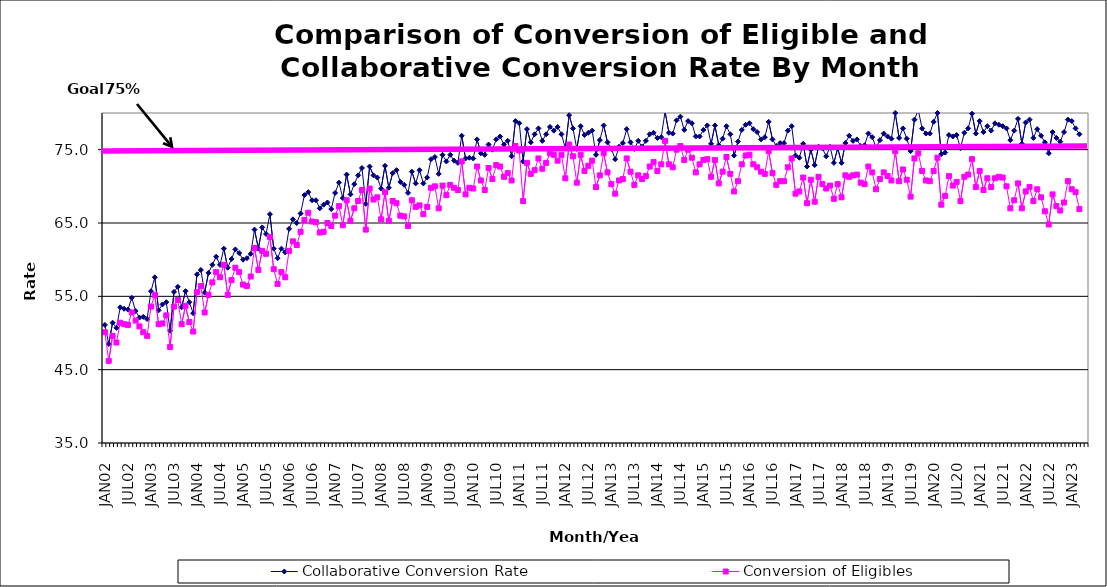
| Category | Collaborative Conversion Rate | Conversion of Eligibles |
|---|---|---|
| JAN02 | 51.1 | 50.1 |
| FEB02 | 48.5 | 46.2 |
| MAR02 | 51.4 | 49.6 |
| APR02 | 50.7 | 48.7 |
| MAY02 | 53.5 | 51.4 |
| JUN02 | 53.3 | 51.2 |
| JUL02 | 53.2 | 51.1 |
| AUG02 | 54.8 | 52.8 |
| SEP02 | 53 | 51.7 |
| OCT02 | 52.1 | 50.9 |
| NOV02 | 52.2 | 50.1 |
| DEC02 | 51.9 | 49.6 |
| JAN03 | 55.7 | 53.6 |
| FEB03 | 57.6 | 55.2 |
| MAR03 | 53.1 | 51.2 |
| APR03 | 53.9 | 51.3 |
| MAY03 | 54.2 | 52.4 |
| JUN03 | 50.3 | 48.1 |
| JUL03 | 55.6 | 53.6 |
| AUG03 | 56.3 | 54.5 |
| SEP03 | 53.5 | 51.2 |
| OCT03 | 55.7 | 53.7 |
| NOV03 | 54.2 | 51.5 |
| DEC03 | 52.7 | 50.2 |
| JAN04 | 58 | 55.6 |
| FEB04 | 58.6 | 56.4 |
| MAR04 | 55.5 | 52.8 |
| APR04 | 58.2 | 55.2 |
| MAY04 | 59.3 | 56.9 |
| JUN04 | 60.4 | 58.3 |
| JUL04 | 59.3 | 57.6 |
| AUG04 | 61.5 | 59.3 |
| SEP04 | 58.9 | 55.2 |
| OCT04 | 60.1 | 57.2 |
| NOV04 | 61.4 | 58.9 |
| DEC04 | 60.9 | 58.3 |
| JAN05 | 60 | 56.6 |
| FEB05 | 60.2 | 56.4 |
| MAR05 | 60.8 | 57.7 |
| APR05 | 64.1 | 61.6 |
| MAY05 | 61.5 | 58.6 |
| JUN05 | 64.4 | 61.2 |
| JUL05 | 63.5 | 60.8 |
| AUG05 | 66.2 | 63.1 |
| SEP05 | 61.5 | 58.7 |
| OCT05 | 60.2 | 56.7 |
| NOV05 | 61.5 | 58.3 |
| DEC05 | 61 | 57.6 |
| JAN06 | 64.2 | 61.2 |
| FEB06 | 65.5 | 62.5 |
| MAR06 | 65 | 62 |
| APR06 | 66.3 | 63.8 |
| MAY06 | 68.8 | 65.4 |
| JUN06 | 69.2 | 66.4 |
| JUL06 | 68.1 | 65.2 |
| AUG06 | 68.1 | 65.1 |
| SEP06 | 67 | 63.7 |
| OCT06 | 67.5 | 63.8 |
| NOV06 | 67.8 | 65 |
| DEC06 | 66.9 | 64.6 |
| JAN07 | 69.1 | 66 |
| FEB07 | 70.5 | 67.3 |
| MAR07 | 68.4 | 64.7 |
| APR07 | 71.6 | 68.1 |
| MAY07 | 68.9 | 65.3 |
| JUN07 | 70.3 | 67 |
| JUL07 | 71.5 | 68 |
| AUG07 | 72.5 | 69.5 |
| SEP07 | 67.6 | 64.1 |
| OCT07 | 72.7 | 69.7 |
| NOV07 | 71.5 | 68.2 |
| DEC07 | 71.2 | 68.5 |
| JAN08 | 69.7 | 65.5 |
| FEB08 | 72.8 | 69.2 |
| MAR08 | 69.8 | 65.3 |
| APR08 | 71.8 | 68 |
| MAY08 | 72.2 | 67.7 |
| JUN08 | 70.6 | 66 |
| JUL08 | 70.2 | 65.9 |
| AUG08 | 69.1 | 64.6 |
| SEP08 | 72 | 68.1 |
| OCT08 | 70.4 | 67.2 |
| NOV08 | 72.2 | 67.4 |
| DEC08 | 70.4 | 66.2 |
| JAN09 | 71.2 | 67.2 |
| FEB09 | 73.7 | 69.8 |
| MAR09 | 74 | 70 |
| APR09 | 71.7 | 67 |
| MAY09 | 74.3 | 70.1 |
| JUN09 | 73.4 | 68.8 |
| JUL09 | 74.3 | 70.2 |
| AUG09 | 73.5 | 69.8 |
| SEP09 | 73.2 | 69.5 |
| OCT09 | 76.9 | 73.4 |
| NOV09 | 73.8 | 68.9 |
| DEC09 | 73.9 | 69.8 |
| JAN10 | 73.8 | 69.7 |
| FEB10 | 76.4 | 72.7 |
| MAR10 | 74.5 | 70.8 |
| APR10 | 74.3 | 69.5 |
| MAY10 | 75.7 | 72.5 |
| JUN10 | 75 | 71 |
| JUL10 | 76.4 | 72.9 |
| AUG10 | 76.8 | 72.7 |
| SEP10 | 75.7 | 71.3 |
| OCT10 | 76.2 | 71.8 |
| NOV10 | 74.1 | 70.8 |
| DEC10 | 78.9 | 75.5 |
| JAN11 | 78.6 | 74.9 |
| FEB11 | 73.4 | 68 |
| MAR11 | 77.8 | 73.2 |
| APR11 | 76 | 71.7 |
| MAY11 | 77.1 | 72.2 |
| JUN11 | 77.9 | 73.8 |
| JUL11 | 76.2 | 72.4 |
| AUG11 | 77.1 | 73.2 |
| SEP11 | 78.1 | 74.5 |
| OCT11 | 77.6 | 74.3 |
| NOV11 | 78.1 | 73.5 |
| DEC11 | 77.1 | 74.3 |
| JAN12 | 75.2 | 71.1 |
| FEB12 | 79.7 | 75.7 |
| MAR12 | 77.9 | 74.1 |
| APR12 | 75.1 | 70.5 |
| MAY12 | 78.2 | 74.3 |
| JUN12 | 77 | 72.1 |
| JUL12 | 77.3 | 72.8 |
| AUG12 | 77.6 | 73.5 |
| SEP12 | 74.3 | 69.9 |
| OCT12 | 76.3 | 71.5 |
| NOV12 | 78.3 | 74.5 |
| DEC12 | 76 | 71.9 |
| JAN13 | 75.1 | 70.3 |
| FEB13 | 73.7 | 69 |
| MAR13 | 75.4 | 70.8 |
| APR13 | 75.9 | 71 |
| MAY13 | 77.8 | 73.8 |
| JUN13 | 76 | 72 |
| JUL13 | 75.1 | 70.2 |
| AUG13 | 76.2 | 71.5 |
| SEP13 | 75.4 | 71 |
| OCT13 | 76.2 | 71.4 |
| NOV13 | 77.1 | 72.7 |
| DEC13 | 77.3 | 73.3 |
| JAN14 | 76.6 | 72.1 |
| FEB14 | 76.7 | 73 |
| MAR14 | 80.2 | 76.2 |
| APR14 | 77.3 | 73 |
| MAY14 | 77.2 | 72.6 |
| JUN14 | 79 | 75 |
| JUL14 | 79.5 | 75.5 |
| AUG14 | 77.7 | 73.6 |
| SEP14 | 78.9 | 75 |
| OCT14 | 78.6 | 73.9 |
| NOV14 | 76.8 | 71.9 |
| DEC14 | 76.8 | 73 |
| JAN15 | 77.7 | 73.6 |
| FEB15 | 78.3 | 73.7 |
| MAR15 | 75.8 | 71.3 |
| APR15 | 78.3 | 73.6 |
| MAY15 | 75.6 | 70.4 |
| JUN15 | 76.5 | 72 |
| JUL15 | 78.2 | 74 |
| AUG15 | 77.1 | 71.7 |
| SEP15 | 74.2 | 69.3 |
| OCT15 | 76.1 | 70.7 |
| NOV15 | 77.7 | 73 |
| DEC15 | 78.4 | 74.2 |
| JAN16 | 78.6 | 74.3 |
| FEB16 | 77.8 | 73 |
| MAR16 | 77.4 | 72.6 |
| APR16 | 76.4 | 72 |
| MAY16 | 76.7 | 71.7 |
| JUN16 | 78.8 | 74.8 |
| JUL16 | 76.4 | 71.8 |
| AUG16 | 75.5 | 70.2 |
| SEP16 | 75.9 | 70.7 |
| OCT16 | 75.9 | 70.7 |
| NOV16 | 77.6 | 72.6 |
| DEC16 | 78.2 | 73.8 |
| JAN17 | 74.2 | 69 |
| FEB17 | 73.9 | 69.3 |
| MAR17 | 75.8 | 71.2 |
| APR17 | 72.7 | 67.7 |
| MAY17 | 75 | 70.9 |
| JUN17 | 72.9 | 67.9 |
| JUL17 | 75.4 | 71.3 |
| AUG17 | 75.2 | 70.3 |
| SEP17 | 74.1 | 69.7 |
| OCT17 | 75.4 | 70.1 |
| NOV17 | 73.2 | 68.3 |
| DEC17 | 75.2 | 70.3 |
| JAN18 | 73.2 | 68.5 |
| FEB18 | 75.9 | 71.5 |
| MAR18 | 76.9 | 71.3 |
| APR18 | 76.2 | 71.5 |
| MAY18 | 76.4 | 71.6 |
| JUN18 | 75.5 | 70.5 |
| JUL18 | 75.6 | 70.3 |
| AUG18 | 77.2 | 72.7 |
| SEP18 | 76.7 | 71.9 |
| OCT18 | 75.3 | 69.6 |
| NOV18 | 76.3 | 71 |
| DEC18 | 77.2 | 71.9 |
| JAN19 | 76.8 | 71.4 |
| FEB19 | 76.5 | 70.8 |
| MAR19 | 80 | 74.8 |
| APR19 | 76.6 | 70.7 |
| MAY19 | 77.9 | 72.3 |
| JUN19 | 76.5 | 70.9 |
| JUL19 | 74.8 | 68.6 |
| AUG19 | 79.1 | 73.8 |
| SEP19 | 80.4 | 74.5 |
| OCT19 | 77.9 | 72.1 |
| NOV19 | 77.2 | 70.8 |
| DEC19 | 77.2 | 70.7 |
| JAN20 | 78.8 | 72.1 |
| FEB20 | 80 | 73.9 |
| MAR20 | 74.4 | 67.5 |
| APR20 | 74.6 | 68.7 |
| MAY20 | 77 | 71.4 |
| JUN20 | 76.8 | 70.1 |
| JUL20 | 77 | 70.6 |
| AUG20 | 75.2 | 68 |
| SEP20 | 77.3 | 71.3 |
| OCT20 | 77.9 | 71.6 |
| NOV20 | 79.9 | 73.7 |
| DEC20 | 77.2 | 69.9 |
| JAN21 | 78.9 | 72.1 |
| FEB21 | 77.4 | 69.5 |
| MAR21 | 78.2 | 71.1 |
| APR21 | 77.6 | 69.9 |
| MAY21 | 78.6 | 71.1 |
| JUN21 | 78.4 | 71.3 |
| JUL21 | 78.2 | 71.2 |
| AUG21 | 77.9 | 70 |
| SEP21 | 76.3 | 67 |
| OCT21 | 77.6 | 68.1 |
| NOV21 | 79.2 | 70.4 |
| DEC21 | 75.8 | 67 |
| JAN22 | 78.7 | 69.3 |
| FEB22 | 79.1 | 69.9 |
| MAR22 | 76.6 | 68 |
| APR22 | 77.8 | 69.6 |
| MAY22 | 76.9 | 68.5 |
| JUN22 | 76 | 66.6 |
| JUL22 | 74.5 | 64.8 |
| AUG22 | 77.4 | 68.9 |
| SEP22 | 76.6 | 67.3 |
| OCT22 | 76.1 | 66.7 |
| NOV22 | 77.4 | 67.8 |
| DEC22 | 79.1 | 70.7 |
| JAN23 | 78.9 | 69.6 |
| FEB23 | 77.9 | 69.2 |
| MAR23 | 77.1 | 66.9 |